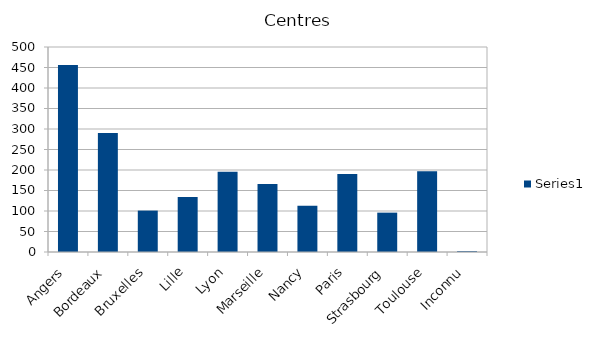
| Category | Series 0 |
|---|---|
| Angers | 464 |
| Bordeaux | 298 |
| Bruxelles | 101 |
| Lille | 132 |
| Lyon | 199 |
| Marseille | 169 |
| Nancy | 117 |
| Paris | 194 |
| Strasbourg | 97 |
| Toulouse | 198 |
| Inconnu | 2 |